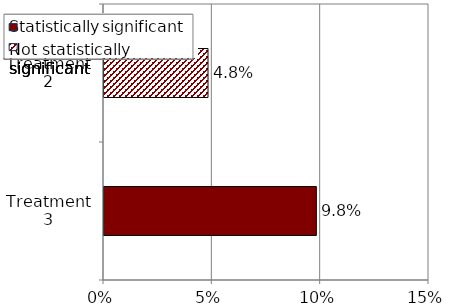
| Category | Series 0 |
|---|---|
| Treatment 3 | 0.098 |
| Treatment 2 | 0.048 |